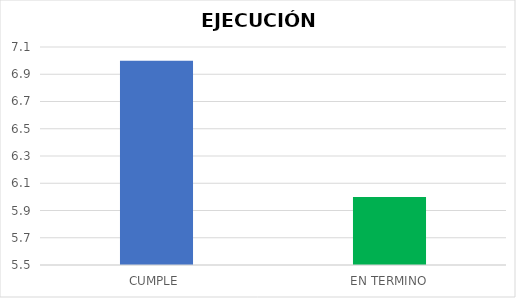
| Category | TOTAL |
|---|---|
| CUMPLE | 7 |
| EN TERMINO | 6 |